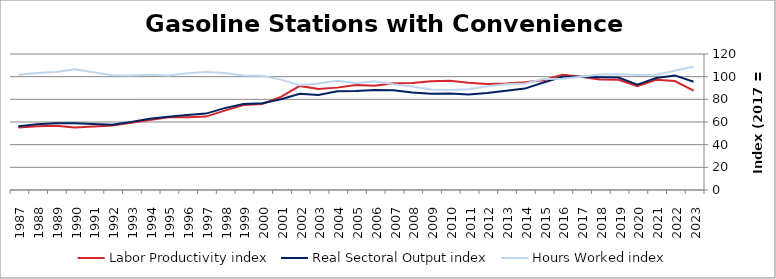
| Category | Labor Productivity index | Real Sectoral Output index | Hours Worked index |
|---|---|---|---|
| 2023.0 | 87.692 | 95.557 | 108.97 |
| 2022.0 | 96.109 | 101.095 | 105.188 |
| 2021.0 | 97.216 | 98.829 | 101.659 |
| 2020.0 | 91.487 | 92.857 | 101.498 |
| 2019.0 | 97.197 | 99.208 | 102.069 |
| 2018.0 | 97.575 | 99.432 | 101.903 |
| 2017.0 | 100 | 100 | 100 |
| 2016.0 | 101.767 | 99.971 | 98.235 |
| 2015.0 | 96.817 | 94.807 | 97.923 |
| 2014.0 | 95.098 | 89.457 | 94.069 |
| 2013.0 | 94.002 | 87.613 | 93.203 |
| 2012.0 | 93.542 | 85.547 | 91.452 |
| 2011.0 | 94.624 | 84.185 | 88.968 |
| 2010.0 | 96.497 | 85.127 | 88.218 |
| 2009.0 | 95.867 | 84.992 | 88.656 |
| 2008.0 | 94.356 | 86.118 | 91.27 |
| 2007.0 | 94.258 | 88.011 | 93.372 |
| 2006.0 | 91.909 | 88.239 | 96.007 |
| 2005.0 | 92.578 | 87.289 | 94.286 |
| 2004.0 | 90.329 | 87.108 | 96.434 |
| 2003.0 | 89.177 | 83.757 | 93.922 |
| 2002.0 | 91.837 | 84.924 | 92.473 |
| 2001.0 | 82.219 | 80.068 | 97.383 |
| 2000.0 | 75.961 | 76.516 | 100.73 |
| 1999.0 | 74.969 | 75.799 | 101.107 |
| 1998.0 | 70.014 | 72.231 | 103.167 |
| 1997.0 | 64.748 | 67.42 | 104.127 |
| 1996.0 | 64.244 | 66.187 | 103.024 |
| 1995.0 | 64.139 | 64.737 | 100.932 |
| 1994.0 | 61.836 | 62.911 | 101.739 |
| 1993.0 | 59.268 | 59.924 | 101.106 |
| 1992.0 | 56.958 | 57.615 | 101.153 |
| 1991.0 | 55.983 | 58.147 | 103.866 |
| 1990.0 | 55.218 | 58.803 | 106.493 |
| 1989.0 | 56.591 | 58.883 | 104.05 |
| 1988.0 | 56.157 | 58.007 | 103.294 |
| 1987.0 | 55.194 | 56.147 | 101.726 |